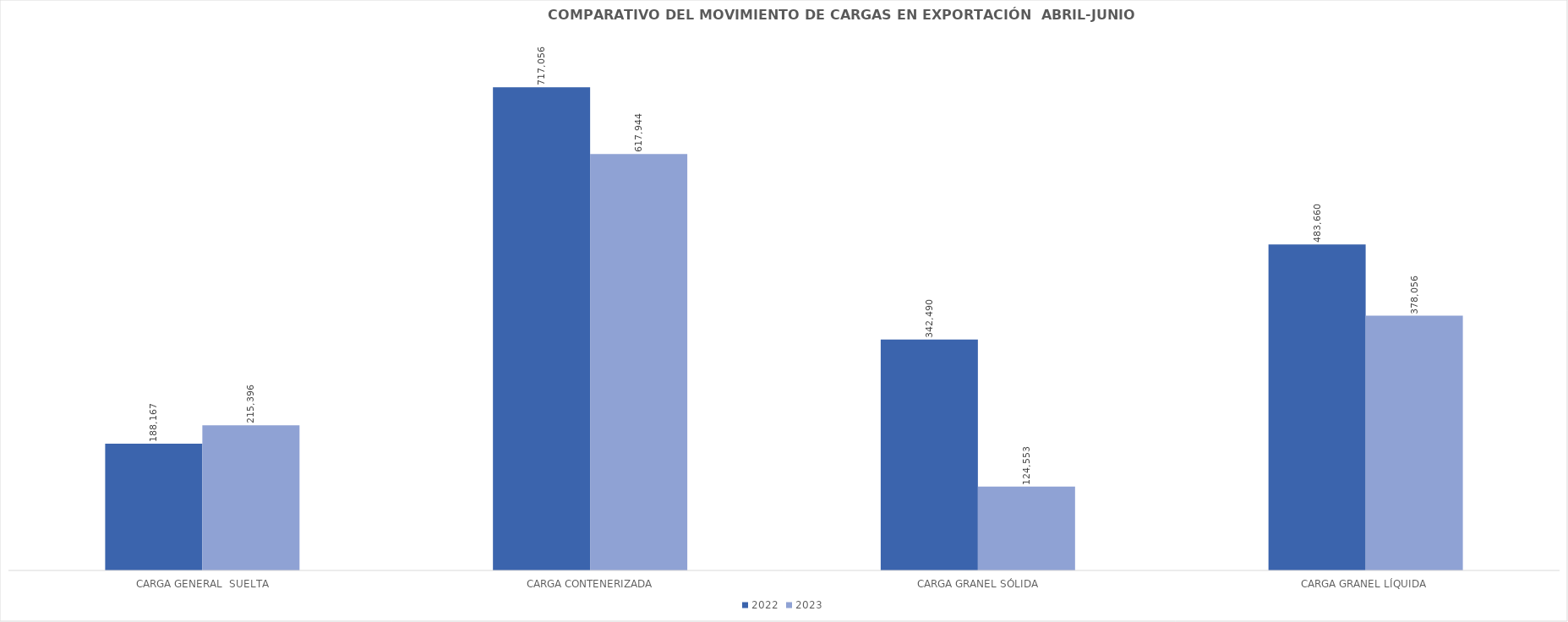
| Category | 2022 | 2023 |
|---|---|---|
|  CARGA GENERAL  SUELTA | 188167 | 215396 |
|  CARGA CONTENERIZADA | 717056 | 617944 |
|  CARGA GRANEL SÓLIDA | 342490 | 124553 |
| CARGA GRANEL LÍQUIDA | 483659.54 | 378056 |